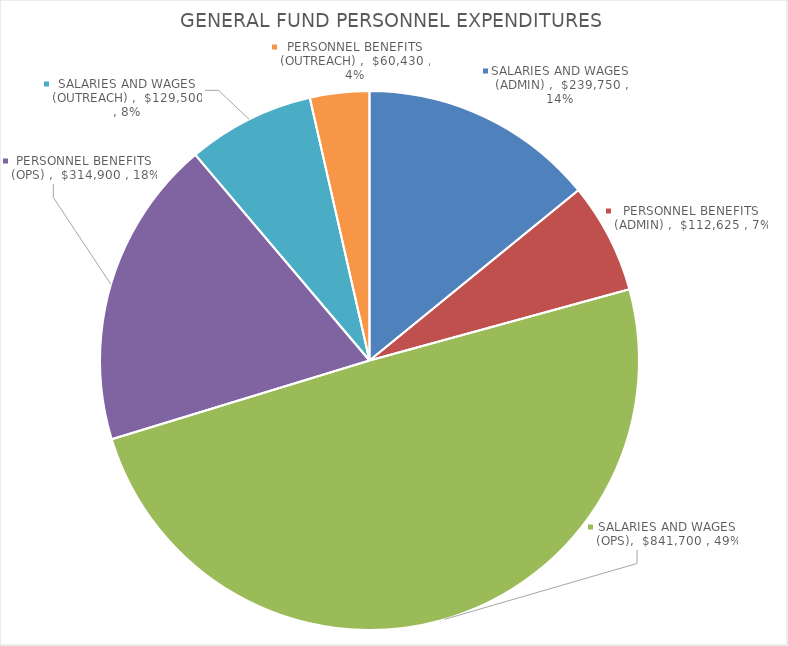
| Category | Series 0 |
|---|---|
| SALARIES AND WAGES (ADMIN)  | 239750 |
| PERSONNEL BENEFITS (ADMIN)  | 112625 |
| SALARIES AND WAGES (OPS) | 841700 |
| PERSONNEL BENEFITS (OPS)  | 314900 |
| SALARIES AND WAGES (OUTREACH)  | 129500 |
| PERSONNEL BENEFITS (OUTREACH)  | 60430 |